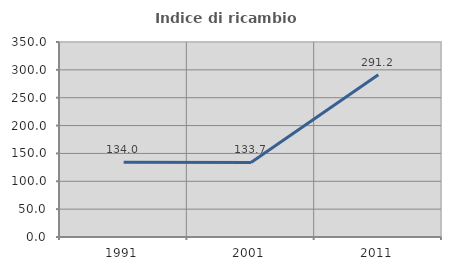
| Category | Indice di ricambio occupazionale  |
|---|---|
| 1991.0 | 134 |
| 2001.0 | 133.721 |
| 2011.0 | 291.228 |